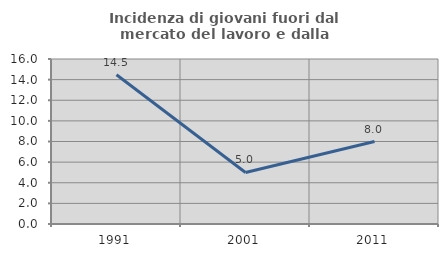
| Category | Incidenza di giovani fuori dal mercato del lavoro e dalla formazione  |
|---|---|
| 1991.0 | 14.474 |
| 2001.0 | 5 |
| 2011.0 | 8 |